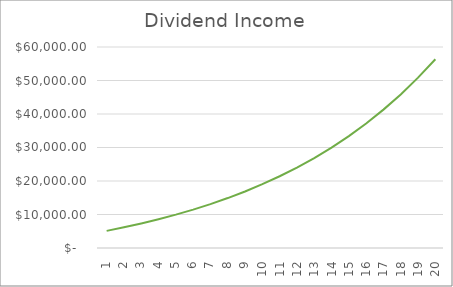
| Category | Dividend Income |
|---|---|
| 1.0 | 5116.19 |
| 2.0 | 6168.591 |
| 3.0 | 7319.026 |
| 4.0 | 8576.92 |
| 5.0 | 9952.654 |
| 6.0 | 11457.676 |
| 7.0 | 13104.613 |
| 8.0 | 14907.401 |
| 9.0 | 16881.425 |
| 10.0 | 19043.683 |
| 11.0 | 21412.962 |
| 12.0 | 24010.039 |
| 13.0 | 26857.899 |
| 14.0 | 29981.99 |
| 15.0 | 33410.496 |
| 16.0 | 37174.651 |
| 17.0 | 41309.087 |
| 18.0 | 45852.224 |
| 19.0 | 50846.707 |
| 20.0 | 56339.901 |